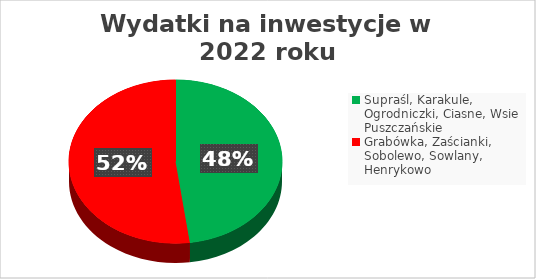
| Category | Series 0 |
|---|---|
| Supraśl, Karakule, Ogrodniczki, Ciasne, Wsie Puszczańskie | 10936810.85 |
| Grabówka, Zaścianki, Sobolewo, Sowlany, Henrykowo | 11915025.91 |